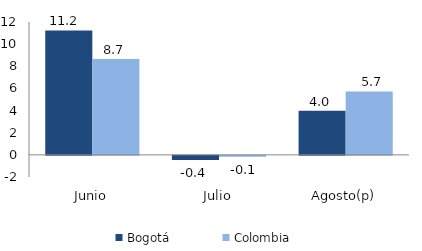
| Category | Bogotá | Colombia |
|---|---|---|
| Junio | 11.235 | 8.662 |
| Julio | -0.367 | -0.075 |
| Agosto(p) | 3.986 | 5.724 |